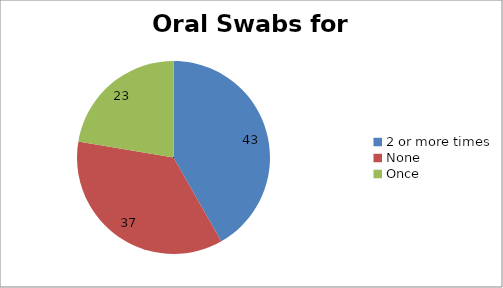
| Category | Series 0 |
|---|---|
| 2 or more times | 43 |
| None | 37 |
| Once | 23 |